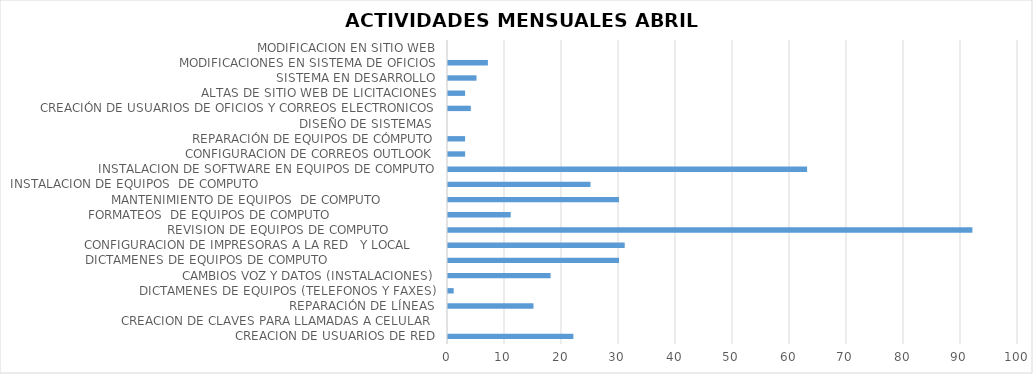
| Category | Series 0 |
|---|---|
| CREACION DE USUARIOS DE RED | 22 |
| CREACION DE CLAVES PARA LLAMADAS A CELULAR  | 0 |
| REPARACIÓN DE LÍNEAS | 15 |
| DICTAMENES DE EQUIPOS (TELEFONOS Y FAXES) | 1 |
| CAMBIOS VOZ Y DATOS (INSTALACIONES) | 18 |
| DICTAMENES DE EQUIPOS DE COMPUTO                             | 30 |
| CONFIGURACION DE IMPRESORAS A LA RED   Y LOCAL       | 31 |
| REVISION DE EQUIPOS DE COMPUTO             | 92 |
| FORMATEOS  DE EQUIPOS DE COMPUTO                            | 11 |
| MANTENIMIENTO DE EQUIPOS  DE COMPUTO               | 30 |
| INSTALACION DE EQUIPOS  DE COMPUTO                                               | 25 |
| INSTALACION DE SOFTWARE EN EQUIPOS DE COMPUTO | 63 |
| CONFIGURACION DE CORREOS OUTLOOK | 3 |
| REPARACIÓN DE EQUIPOS DE CÓMPUTO | 3 |
| DISEÑO DE SISTEMAS  | 0 |
| CREACIÓN DE USUARIOS DE OFICIOS Y CORREOS ELECTRONICOS | 4 |
| ALTAS DE SITIO WEB DE LICITACIONES | 3 |
| SISTEMA EN DESARROLLO | 5 |
| MODIFICACIONES EN SISTEMA DE OFICIOS | 7 |
| MODIFICACION EN SITIO WEB | 0 |